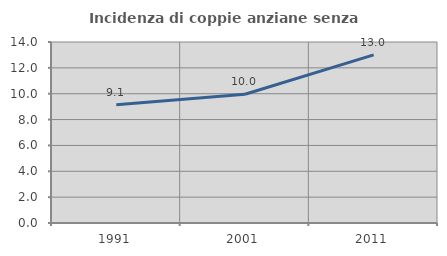
| Category | Incidenza di coppie anziane senza figli  |
|---|---|
| 1991.0 | 9.145 |
| 2001.0 | 9.961 |
| 2011.0 | 13.002 |